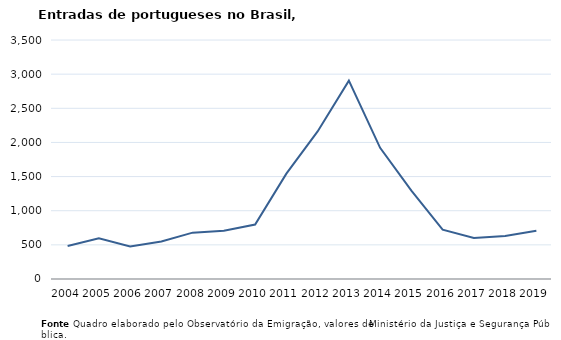
| Category | Entradas |
|---|---|
| 2004.0 | 482 |
| 2005.0 | 595 |
| 2006.0 | 477 |
| 2007.0 | 550 |
| 2008.0 | 679 |
| 2009.0 | 708 |
| 2010.0 | 798 |
| 2011.0 | 1543 |
| 2012.0 | 2161 |
| 2013.0 | 2904 |
| 2014.0 | 1921 |
| 2015.0 | 1294 |
| 2016.0 | 722 |
| 2017.0 | 601 |
| 2018.0 | 631 |
| 2019.0 | 705 |